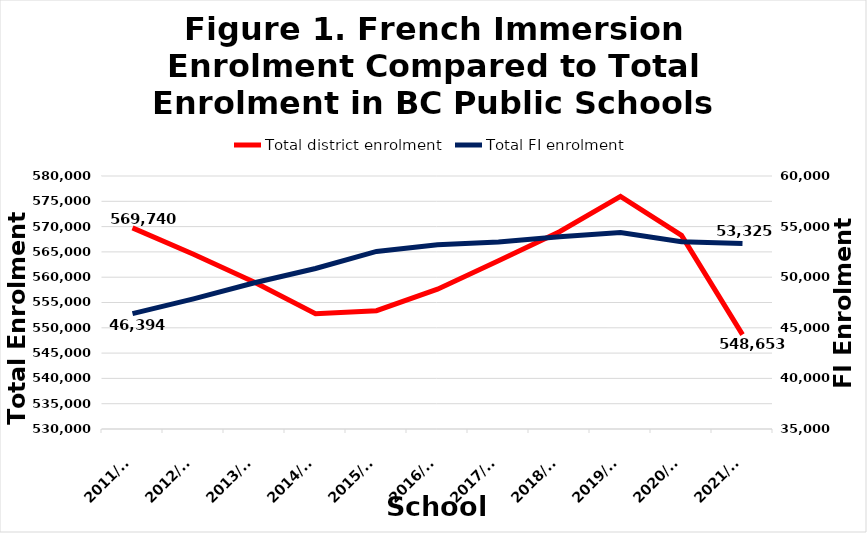
| Category | Total district enrolment  |
|---|---|
| 2011/12 | 569740 |
| 2012/13 | 564532 |
| 2013/14 | 558985 |
| 2014/15 | 552786 |
| 2015/16 | 553378 |
| 2016/17 | 557630 |
| 2017/18 | 563247 |
| 2018/19 | 568983 |
| 2019/20 | 575986 |
| 2020/21 | 568271 |
| 2021/22 | 548653 |